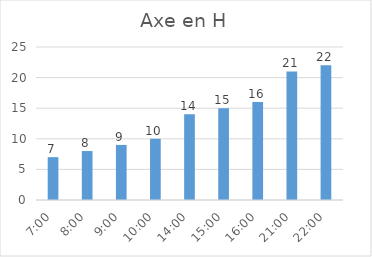
| Category | Series 0 |
|---|---|
| 0.2916666666666667 | 7 |
| 0.3333333333333333 | 8 |
| 0.375 | 9 |
| 0.4166666666666667 | 10 |
| 0.5833333333333334 | 14 |
| 0.625 | 15 |
| 0.6666666666666666 | 16 |
| 0.875 | 21 |
| 0.9166666666666666 | 22 |